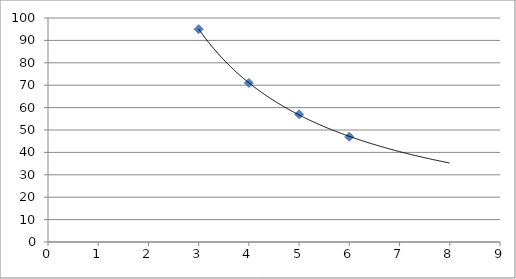
| Category | Series 0 |
|---|---|
| 3.0 | 95 |
| 4.0 | 71 |
| 5.0 | 57 |
| 6.0 | 47 |